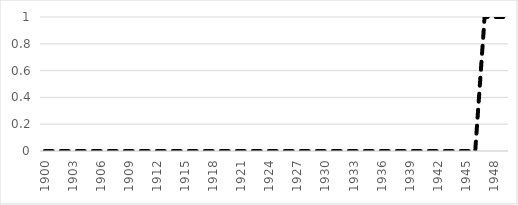
| Category | method6 |
|---|---|
| 1900-01-01 | 0 |
| 1901-01-01 | 0 |
| 1902-01-01 | 0 |
| 1903-01-01 | 0 |
| 1904-01-01 | 0 |
| 1905-01-01 | 0 |
| 1906-01-01 | 0 |
| 1907-01-01 | 0 |
| 1908-01-01 | 0 |
| 1909-01-01 | 0 |
| 1910-01-01 | 0 |
| 1911-01-01 | 0 |
| 1912-01-01 | 0 |
| 1913-01-01 | 0 |
| 1914-01-01 | 0 |
| 1915-01-01 | 0 |
| 1916-01-01 | 0 |
| 1917-01-01 | 0 |
| 1918-01-01 | 0 |
| 1919-01-01 | 0 |
| 1920-01-01 | 0 |
| 1921-01-01 | 0 |
| 1922-01-01 | 0 |
| 1923-01-01 | 0 |
| 1924-01-01 | 0 |
| 1925-01-01 | 0 |
| 1926-01-01 | 0 |
| 1927-01-01 | 0 |
| 1928-01-01 | 0 |
| 1929-01-01 | 0 |
| 1930-01-01 | 0 |
| 1931-01-01 | 0 |
| 1932-01-01 | 0 |
| 1933-01-01 | 0 |
| 1934-01-01 | 0 |
| 1935-01-01 | 0 |
| 1936-01-01 | 0 |
| 1937-01-01 | 0 |
| 1938-01-01 | 0 |
| 1939-01-01 | 0 |
| 1940-01-01 | 0 |
| 1941-01-01 | 0 |
| 1942-01-01 | 0 |
| 1943-01-01 | 0 |
| 1944-01-01 | 0 |
| 1945-01-01 | 0 |
| 1946-01-01 | 0 |
| 1947-01-01 | 1 |
| 1948-01-01 | 1 |
| 1949-01-01 | 1 |